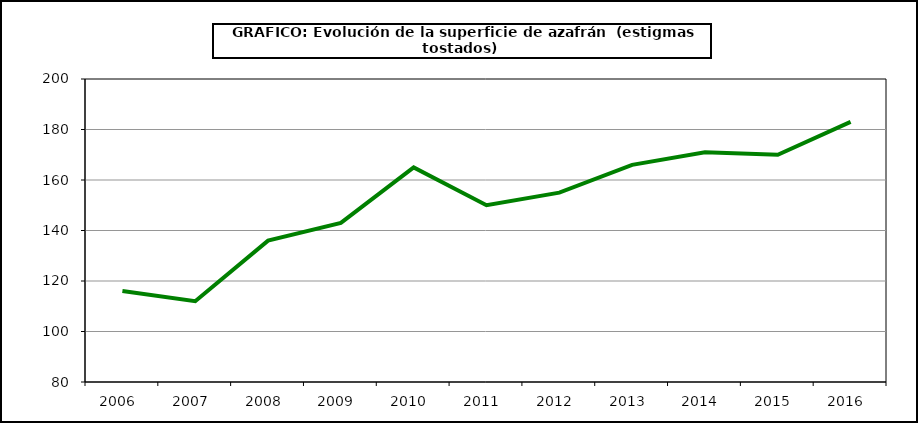
| Category | Superficie |
|---|---|
| 2006.0 | 116 |
| 2007.0 | 112 |
| 2008.0 | 136 |
| 2009.0 | 143 |
| 2010.0 | 165 |
| 2011.0 | 150 |
| 2012.0 | 155 |
| 2013.0 | 166 |
| 2014.0 | 171 |
| 2015.0 | 170 |
| 2016.0 | 183 |